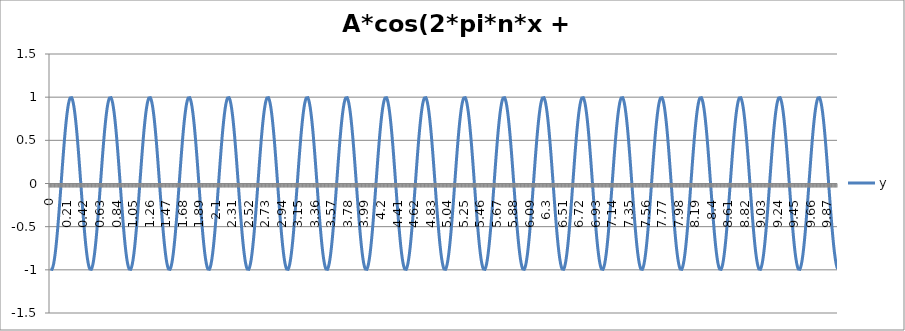
| Category | y |
|---|---|
| 0.0 | -0.99 |
| 0.01 | -1 |
| 0.02 | -0.994 |
| 0.03 | -0.972 |
| 0.04 | -0.936 |
| 0.05 | -0.884 |
| 0.060000000000000005 | -0.818 |
| 0.07 | -0.74 |
| 0.08 | -0.65 |
| 0.09 | -0.549 |
| 0.09999999999999999 | -0.44 |
| 0.10999999999999999 | -0.324 |
| 0.11999999999999998 | -0.203 |
| 0.12999999999999998 | -0.079 |
| 0.13999999999999999 | 0.047 |
| 0.15 | 0.172 |
| 0.16 | 0.294 |
| 0.17 | 0.411 |
| 0.18000000000000002 | 0.522 |
| 0.19000000000000003 | 0.625 |
| 0.20000000000000004 | 0.718 |
| 0.21000000000000005 | 0.8 |
| 0.22000000000000006 | 0.869 |
| 0.23000000000000007 | 0.924 |
| 0.24000000000000007 | 0.964 |
| 0.25000000000000006 | 0.99 |
| 0.26000000000000006 | 1 |
| 0.2700000000000001 | 0.994 |
| 0.2800000000000001 | 0.972 |
| 0.2900000000000001 | 0.936 |
| 0.3000000000000001 | 0.884 |
| 0.3100000000000001 | 0.818 |
| 0.3200000000000001 | 0.74 |
| 0.3300000000000001 | 0.65 |
| 0.34000000000000014 | 0.549 |
| 0.35000000000000014 | 0.44 |
| 0.36000000000000015 | 0.324 |
| 0.37000000000000016 | 0.203 |
| 0.38000000000000017 | 0.079 |
| 0.3900000000000002 | -0.047 |
| 0.4000000000000002 | -0.172 |
| 0.4100000000000002 | -0.294 |
| 0.4200000000000002 | -0.411 |
| 0.4300000000000002 | -0.522 |
| 0.4400000000000002 | -0.625 |
| 0.45000000000000023 | -0.718 |
| 0.46000000000000024 | -0.8 |
| 0.47000000000000025 | -0.869 |
| 0.48000000000000026 | -0.924 |
| 0.49000000000000027 | -0.964 |
| 0.5000000000000002 | -0.99 |
| 0.5100000000000002 | -1 |
| 0.5200000000000002 | -0.994 |
| 0.5300000000000002 | -0.972 |
| 0.5400000000000003 | -0.936 |
| 0.5500000000000003 | -0.884 |
| 0.5600000000000003 | -0.818 |
| 0.5700000000000003 | -0.74 |
| 0.5800000000000003 | -0.65 |
| 0.5900000000000003 | -0.549 |
| 0.6000000000000003 | -0.44 |
| 0.6100000000000003 | -0.324 |
| 0.6200000000000003 | -0.203 |
| 0.6300000000000003 | -0.079 |
| 0.6400000000000003 | 0.047 |
| 0.6500000000000004 | 0.172 |
| 0.6600000000000004 | 0.294 |
| 0.6700000000000004 | 0.411 |
| 0.6800000000000004 | 0.522 |
| 0.6900000000000004 | 0.625 |
| 0.7000000000000004 | 0.718 |
| 0.7100000000000004 | 0.8 |
| 0.7200000000000004 | 0.869 |
| 0.7300000000000004 | 0.924 |
| 0.7400000000000004 | 0.964 |
| 0.7500000000000004 | 0.99 |
| 0.7600000000000005 | 1 |
| 0.7700000000000005 | 0.994 |
| 0.7800000000000005 | 0.972 |
| 0.7900000000000005 | 0.936 |
| 0.8000000000000005 | 0.884 |
| 0.8100000000000005 | 0.818 |
| 0.8200000000000005 | 0.74 |
| 0.8300000000000005 | 0.65 |
| 0.8400000000000005 | 0.549 |
| 0.8500000000000005 | 0.44 |
| 0.8600000000000005 | 0.324 |
| 0.8700000000000006 | 0.203 |
| 0.8800000000000006 | 0.079 |
| 0.8900000000000006 | -0.047 |
| 0.9000000000000006 | -0.172 |
| 0.9100000000000006 | -0.294 |
| 0.9200000000000006 | -0.411 |
| 0.9300000000000006 | -0.522 |
| 0.9400000000000006 | -0.625 |
| 0.9500000000000006 | -0.718 |
| 0.9600000000000006 | -0.8 |
| 0.9700000000000006 | -0.869 |
| 0.9800000000000006 | -0.924 |
| 0.9900000000000007 | -0.964 |
| 1.0000000000000007 | -0.99 |
| 1.0100000000000007 | -1 |
| 1.0200000000000007 | -0.994 |
| 1.0300000000000007 | -0.972 |
| 1.0400000000000007 | -0.936 |
| 1.0500000000000007 | -0.884 |
| 1.0600000000000007 | -0.818 |
| 1.0700000000000007 | -0.74 |
| 1.0800000000000007 | -0.65 |
| 1.0900000000000007 | -0.549 |
| 1.1000000000000008 | -0.44 |
| 1.1100000000000008 | -0.324 |
| 1.1200000000000008 | -0.203 |
| 1.1300000000000008 | -0.079 |
| 1.1400000000000008 | 0.047 |
| 1.1500000000000008 | 0.172 |
| 1.1600000000000008 | 0.294 |
| 1.1700000000000008 | 0.411 |
| 1.1800000000000008 | 0.522 |
| 1.1900000000000008 | 0.625 |
| 1.2000000000000008 | 0.718 |
| 1.2100000000000009 | 0.8 |
| 1.2200000000000009 | 0.869 |
| 1.2300000000000009 | 0.924 |
| 1.2400000000000009 | 0.964 |
| 1.2500000000000009 | 0.99 |
| 1.260000000000001 | 1 |
| 1.270000000000001 | 0.994 |
| 1.280000000000001 | 0.972 |
| 1.290000000000001 | 0.936 |
| 1.300000000000001 | 0.884 |
| 1.310000000000001 | 0.818 |
| 1.320000000000001 | 0.74 |
| 1.330000000000001 | 0.65 |
| 1.340000000000001 | 0.549 |
| 1.350000000000001 | 0.44 |
| 1.360000000000001 | 0.324 |
| 1.370000000000001 | 0.203 |
| 1.380000000000001 | 0.079 |
| 1.390000000000001 | -0.047 |
| 1.400000000000001 | -0.172 |
| 1.410000000000001 | -0.294 |
| 1.420000000000001 | -0.411 |
| 1.430000000000001 | -0.522 |
| 1.440000000000001 | -0.625 |
| 1.450000000000001 | -0.718 |
| 1.460000000000001 | -0.8 |
| 1.470000000000001 | -0.869 |
| 1.480000000000001 | -0.924 |
| 1.490000000000001 | -0.964 |
| 1.500000000000001 | -0.99 |
| 1.5100000000000011 | -1 |
| 1.5200000000000011 | -0.994 |
| 1.5300000000000011 | -0.972 |
| 1.5400000000000011 | -0.936 |
| 1.5500000000000012 | -0.884 |
| 1.5600000000000012 | -0.818 |
| 1.5700000000000012 | -0.74 |
| 1.5800000000000012 | -0.65 |
| 1.5900000000000012 | -0.549 |
| 1.6000000000000012 | -0.44 |
| 1.6100000000000012 | -0.324 |
| 1.6200000000000012 | -0.203 |
| 1.6300000000000012 | -0.079 |
| 1.6400000000000012 | 0.047 |
| 1.6500000000000012 | 0.172 |
| 1.6600000000000013 | 0.294 |
| 1.6700000000000013 | 0.411 |
| 1.6800000000000013 | 0.522 |
| 1.6900000000000013 | 0.625 |
| 1.7000000000000013 | 0.718 |
| 1.7100000000000013 | 0.8 |
| 1.7200000000000013 | 0.869 |
| 1.7300000000000013 | 0.924 |
| 1.7400000000000013 | 0.964 |
| 1.7500000000000013 | 0.99 |
| 1.7600000000000013 | 1 |
| 1.7700000000000014 | 0.994 |
| 1.7800000000000014 | 0.972 |
| 1.7900000000000014 | 0.936 |
| 1.8000000000000014 | 0.884 |
| 1.8100000000000014 | 0.818 |
| 1.8200000000000014 | 0.74 |
| 1.8300000000000014 | 0.65 |
| 1.8400000000000014 | 0.549 |
| 1.8500000000000014 | 0.44 |
| 1.8600000000000014 | 0.324 |
| 1.8700000000000014 | 0.203 |
| 1.8800000000000014 | 0.079 |
| 1.8900000000000015 | -0.047 |
| 1.9000000000000015 | -0.172 |
| 1.9100000000000015 | -0.294 |
| 1.9200000000000015 | -0.411 |
| 1.9300000000000015 | -0.522 |
| 1.9400000000000015 | -0.625 |
| 1.9500000000000015 | -0.718 |
| 1.9600000000000015 | -0.8 |
| 1.9700000000000015 | -0.869 |
| 1.9800000000000015 | -0.924 |
| 1.9900000000000015 | -0.964 |
| 2.0000000000000013 | -0.99 |
| 2.010000000000001 | -1 |
| 2.020000000000001 | -0.994 |
| 2.0300000000000007 | -0.972 |
| 2.0400000000000005 | -0.936 |
| 2.0500000000000003 | -0.884 |
| 2.06 | -0.818 |
| 2.07 | -0.74 |
| 2.0799999999999996 | -0.65 |
| 2.0899999999999994 | -0.549 |
| 2.099999999999999 | -0.44 |
| 2.109999999999999 | -0.324 |
| 2.1199999999999988 | -0.203 |
| 2.1299999999999986 | -0.079 |
| 2.1399999999999983 | 0.047 |
| 2.149999999999998 | 0.172 |
| 2.159999999999998 | 0.294 |
| 2.1699999999999977 | 0.411 |
| 2.1799999999999975 | 0.522 |
| 2.1899999999999973 | 0.625 |
| 2.199999999999997 | 0.718 |
| 2.209999999999997 | 0.8 |
| 2.2199999999999966 | 0.869 |
| 2.2299999999999964 | 0.924 |
| 2.239999999999996 | 0.964 |
| 2.249999999999996 | 0.99 |
| 2.259999999999996 | 1 |
| 2.2699999999999956 | 0.994 |
| 2.2799999999999954 | 0.972 |
| 2.289999999999995 | 0.936 |
| 2.299999999999995 | 0.884 |
| 2.3099999999999947 | 0.818 |
| 2.3199999999999945 | 0.74 |
| 2.3299999999999943 | 0.65 |
| 2.339999999999994 | 0.549 |
| 2.349999999999994 | 0.44 |
| 2.3599999999999937 | 0.324 |
| 2.3699999999999934 | 0.203 |
| 2.3799999999999932 | 0.079 |
| 2.389999999999993 | -0.047 |
| 2.399999999999993 | -0.172 |
| 2.4099999999999926 | -0.294 |
| 2.4199999999999924 | -0.411 |
| 2.429999999999992 | -0.522 |
| 2.439999999999992 | -0.625 |
| 2.4499999999999917 | -0.718 |
| 2.4599999999999915 | -0.8 |
| 2.4699999999999913 | -0.869 |
| 2.479999999999991 | -0.924 |
| 2.489999999999991 | -0.964 |
| 2.4999999999999907 | -0.99 |
| 2.5099999999999905 | -1 |
| 2.5199999999999902 | -0.994 |
| 2.52999999999999 | -0.972 |
| 2.53999999999999 | -0.936 |
| 2.5499999999999896 | -0.884 |
| 2.5599999999999894 | -0.818 |
| 2.569999999999989 | -0.74 |
| 2.579999999999989 | -0.65 |
| 2.5899999999999888 | -0.549 |
| 2.5999999999999885 | -0.44 |
| 2.6099999999999883 | -0.324 |
| 2.619999999999988 | -0.203 |
| 2.629999999999988 | -0.079 |
| 2.6399999999999877 | 0.047 |
| 2.6499999999999875 | 0.172 |
| 2.6599999999999873 | 0.294 |
| 2.669999999999987 | 0.411 |
| 2.679999999999987 | 0.522 |
| 2.6899999999999866 | 0.625 |
| 2.6999999999999864 | 0.718 |
| 2.709999999999986 | 0.8 |
| 2.719999999999986 | 0.869 |
| 2.7299999999999858 | 0.924 |
| 2.7399999999999856 | 0.964 |
| 2.7499999999999853 | 0.99 |
| 2.759999999999985 | 1 |
| 2.769999999999985 | 0.994 |
| 2.7799999999999847 | 0.972 |
| 2.7899999999999845 | 0.936 |
| 2.7999999999999843 | 0.884 |
| 2.809999999999984 | 0.818 |
| 2.819999999999984 | 0.74 |
| 2.8299999999999836 | 0.65 |
| 2.8399999999999834 | 0.549 |
| 2.849999999999983 | 0.44 |
| 2.859999999999983 | 0.324 |
| 2.869999999999983 | 0.203 |
| 2.8799999999999826 | 0.079 |
| 2.8899999999999824 | -0.047 |
| 2.899999999999982 | -0.172 |
| 2.909999999999982 | -0.294 |
| 2.9199999999999817 | -0.411 |
| 2.9299999999999815 | -0.522 |
| 2.9399999999999813 | -0.625 |
| 2.949999999999981 | -0.718 |
| 2.959999999999981 | -0.8 |
| 2.9699999999999807 | -0.869 |
| 2.9799999999999804 | -0.924 |
| 2.9899999999999802 | -0.964 |
| 2.99999999999998 | -0.99 |
| 3.00999999999998 | -1 |
| 3.0199999999999796 | -0.994 |
| 3.0299999999999794 | -0.972 |
| 3.039999999999979 | -0.936 |
| 3.049999999999979 | -0.884 |
| 3.0599999999999787 | -0.818 |
| 3.0699999999999785 | -0.74 |
| 3.0799999999999783 | -0.65 |
| 3.089999999999978 | -0.549 |
| 3.099999999999978 | -0.44 |
| 3.1099999999999777 | -0.324 |
| 3.1199999999999775 | -0.203 |
| 3.1299999999999772 | -0.079 |
| 3.139999999999977 | 0.047 |
| 3.149999999999977 | 0.172 |
| 3.1599999999999766 | 0.294 |
| 3.1699999999999764 | 0.411 |
| 3.179999999999976 | 0.522 |
| 3.189999999999976 | 0.625 |
| 3.1999999999999758 | 0.718 |
| 3.2099999999999755 | 0.8 |
| 3.2199999999999753 | 0.869 |
| 3.229999999999975 | 0.924 |
| 3.239999999999975 | 0.964 |
| 3.2499999999999747 | 0.99 |
| 3.2599999999999745 | 1 |
| 3.2699999999999743 | 0.994 |
| 3.279999999999974 | 0.972 |
| 3.289999999999974 | 0.936 |
| 3.2999999999999736 | 0.884 |
| 3.3099999999999734 | 0.818 |
| 3.319999999999973 | 0.74 |
| 3.329999999999973 | 0.65 |
| 3.3399999999999728 | 0.549 |
| 3.3499999999999726 | 0.44 |
| 3.3599999999999723 | 0.324 |
| 3.369999999999972 | 0.203 |
| 3.379999999999972 | 0.079 |
| 3.3899999999999717 | -0.047 |
| 3.3999999999999715 | -0.172 |
| 3.4099999999999713 | -0.294 |
| 3.419999999999971 | -0.411 |
| 3.429999999999971 | -0.522 |
| 3.4399999999999706 | -0.625 |
| 3.4499999999999704 | -0.718 |
| 3.45999999999997 | -0.8 |
| 3.46999999999997 | -0.869 |
| 3.47999999999997 | -0.924 |
| 3.4899999999999696 | -0.964 |
| 3.4999999999999694 | -0.99 |
| 3.509999999999969 | -1 |
| 3.519999999999969 | -0.994 |
| 3.5299999999999687 | -0.972 |
| 3.5399999999999685 | -0.936 |
| 3.5499999999999683 | -0.884 |
| 3.559999999999968 | -0.818 |
| 3.569999999999968 | -0.74 |
| 3.5799999999999677 | -0.65 |
| 3.5899999999999674 | -0.549 |
| 3.5999999999999672 | -0.44 |
| 3.609999999999967 | -0.324 |
| 3.619999999999967 | -0.203 |
| 3.6299999999999666 | -0.079 |
| 3.6399999999999664 | 0.047 |
| 3.649999999999966 | 0.172 |
| 3.659999999999966 | 0.294 |
| 3.6699999999999657 | 0.411 |
| 3.6799999999999655 | 0.522 |
| 3.6899999999999653 | 0.625 |
| 3.699999999999965 | 0.718 |
| 3.709999999999965 | 0.8 |
| 3.7199999999999647 | 0.869 |
| 3.7299999999999645 | 0.924 |
| 3.7399999999999642 | 0.964 |
| 3.749999999999964 | 0.99 |
| 3.759999999999964 | 1 |
| 3.7699999999999636 | 0.994 |
| 3.7799999999999634 | 0.972 |
| 3.789999999999963 | 0.936 |
| 3.799999999999963 | 0.884 |
| 3.8099999999999627 | 0.818 |
| 3.8199999999999625 | 0.74 |
| 3.8299999999999623 | 0.65 |
| 3.839999999999962 | 0.549 |
| 3.849999999999962 | 0.44 |
| 3.8599999999999617 | 0.324 |
| 3.8699999999999615 | 0.203 |
| 3.8799999999999613 | 0.079 |
| 3.889999999999961 | -0.047 |
| 3.899999999999961 | -0.172 |
| 3.9099999999999606 | -0.294 |
| 3.9199999999999604 | -0.411 |
| 3.92999999999996 | -0.522 |
| 3.93999999999996 | -0.625 |
| 3.9499999999999598 | -0.718 |
| 3.9599999999999596 | -0.8 |
| 3.9699999999999593 | -0.869 |
| 3.979999999999959 | -0.924 |
| 3.989999999999959 | -0.964 |
| 3.9999999999999587 | -0.99 |
| 4.009999999999959 | -1 |
| 4.019999999999959 | -0.994 |
| 4.0299999999999585 | -0.972 |
| 4.039999999999958 | -0.936 |
| 4.049999999999958 | -0.884 |
| 4.059999999999958 | -0.818 |
| 4.069999999999958 | -0.74 |
| 4.079999999999957 | -0.65 |
| 4.089999999999957 | -0.549 |
| 4.099999999999957 | -0.44 |
| 4.109999999999957 | -0.324 |
| 4.119999999999957 | -0.203 |
| 4.129999999999956 | -0.079 |
| 4.139999999999956 | 0.047 |
| 4.149999999999956 | 0.172 |
| 4.159999999999956 | 0.294 |
| 4.1699999999999555 | 0.411 |
| 4.179999999999955 | 0.522 |
| 4.189999999999955 | 0.625 |
| 4.199999999999955 | 0.718 |
| 4.209999999999955 | 0.8 |
| 4.2199999999999545 | 0.869 |
| 4.229999999999954 | 0.924 |
| 4.239999999999954 | 0.964 |
| 4.249999999999954 | 0.99 |
| 4.259999999999954 | 1 |
| 4.269999999999953 | 0.994 |
| 4.279999999999953 | 0.972 |
| 4.289999999999953 | 0.936 |
| 4.299999999999953 | 0.884 |
| 4.3099999999999525 | 0.818 |
| 4.319999999999952 | 0.74 |
| 4.329999999999952 | 0.65 |
| 4.339999999999952 | 0.549 |
| 4.349999999999952 | 0.44 |
| 4.3599999999999515 | 0.324 |
| 4.369999999999951 | 0.203 |
| 4.379999999999951 | 0.079 |
| 4.389999999999951 | -0.047 |
| 4.399999999999951 | -0.172 |
| 4.40999999999995 | -0.294 |
| 4.41999999999995 | -0.411 |
| 4.42999999999995 | -0.522 |
| 4.43999999999995 | -0.625 |
| 4.4499999999999496 | -0.718 |
| 4.459999999999949 | -0.8 |
| 4.469999999999949 | -0.869 |
| 4.479999999999949 | -0.924 |
| 4.489999999999949 | -0.964 |
| 4.4999999999999485 | -0.99 |
| 4.509999999999948 | -1 |
| 4.519999999999948 | -0.994 |
| 4.529999999999948 | -0.972 |
| 4.539999999999948 | -0.936 |
| 4.549999999999947 | -0.884 |
| 4.559999999999947 | -0.818 |
| 4.569999999999947 | -0.74 |
| 4.579999999999947 | -0.65 |
| 4.589999999999947 | -0.549 |
| 4.599999999999946 | -0.44 |
| 4.609999999999946 | -0.324 |
| 4.619999999999946 | -0.203 |
| 4.629999999999946 | -0.079 |
| 4.6399999999999455 | 0.047 |
| 4.649999999999945 | 0.172 |
| 4.659999999999945 | 0.294 |
| 4.669999999999945 | 0.411 |
| 4.679999999999945 | 0.522 |
| 4.689999999999944 | 0.625 |
| 4.699999999999944 | 0.718 |
| 4.709999999999944 | 0.8 |
| 4.719999999999944 | 0.869 |
| 4.729999999999944 | 0.924 |
| 4.739999999999943 | 0.964 |
| 4.749999999999943 | 0.99 |
| 4.759999999999943 | 1 |
| 4.769999999999943 | 0.994 |
| 4.7799999999999425 | 0.972 |
| 4.789999999999942 | 0.936 |
| 4.799999999999942 | 0.884 |
| 4.809999999999942 | 0.818 |
| 4.819999999999942 | 0.74 |
| 4.8299999999999415 | 0.65 |
| 4.839999999999941 | 0.549 |
| 4.849999999999941 | 0.44 |
| 4.859999999999941 | 0.324 |
| 4.869999999999941 | 0.203 |
| 4.87999999999994 | 0.079 |
| 4.88999999999994 | -0.047 |
| 4.89999999999994 | -0.172 |
| 4.90999999999994 | -0.294 |
| 4.9199999999999395 | -0.411 |
| 4.929999999999939 | -0.522 |
| 4.939999999999939 | -0.625 |
| 4.949999999999939 | -0.718 |
| 4.959999999999939 | -0.8 |
| 4.9699999999999385 | -0.869 |
| 4.979999999999938 | -0.924 |
| 4.989999999999938 | -0.964 |
| 4.999999999999938 | -0.99 |
| 5.009999999999938 | -1 |
| 5.019999999999937 | -0.994 |
| 5.029999999999937 | -0.972 |
| 5.039999999999937 | -0.936 |
| 5.049999999999937 | -0.884 |
| 5.0599999999999365 | -0.818 |
| 5.069999999999936 | -0.74 |
| 5.079999999999936 | -0.65 |
| 5.089999999999936 | -0.549 |
| 5.099999999999936 | -0.44 |
| 5.1099999999999355 | -0.324 |
| 5.119999999999935 | -0.203 |
| 5.129999999999935 | -0.079 |
| 5.139999999999935 | 0.047 |
| 5.149999999999935 | 0.172 |
| 5.159999999999934 | 0.294 |
| 5.169999999999934 | 0.411 |
| 5.179999999999934 | 0.522 |
| 5.189999999999934 | 0.625 |
| 5.199999999999934 | 0.718 |
| 5.209999999999933 | 0.8 |
| 5.219999999999933 | 0.869 |
| 5.229999999999933 | 0.924 |
| 5.239999999999933 | 0.964 |
| 5.2499999999999325 | 0.99 |
| 5.259999999999932 | 1 |
| 5.269999999999932 | 0.994 |
| 5.279999999999932 | 0.972 |
| 5.289999999999932 | 0.936 |
| 5.299999999999931 | 0.884 |
| 5.309999999999931 | 0.818 |
| 5.319999999999931 | 0.74 |
| 5.329999999999931 | 0.65 |
| 5.339999999999931 | 0.549 |
| 5.34999999999993 | 0.44 |
| 5.35999999999993 | 0.324 |
| 5.36999999999993 | 0.203 |
| 5.37999999999993 | 0.079 |
| 5.3899999999999295 | -0.047 |
| 5.399999999999929 | -0.172 |
| 5.409999999999929 | -0.294 |
| 5.419999999999929 | -0.411 |
| 5.429999999999929 | -0.522 |
| 5.4399999999999284 | -0.625 |
| 5.449999999999928 | -0.718 |
| 5.459999999999928 | -0.8 |
| 5.469999999999928 | -0.869 |
| 5.479999999999928 | -0.924 |
| 5.489999999999927 | -0.964 |
| 5.499999999999927 | -0.99 |
| 5.509999999999927 | -1 |
| 5.519999999999927 | -0.994 |
| 5.5299999999999265 | -0.972 |
| 5.539999999999926 | -0.936 |
| 5.549999999999926 | -0.884 |
| 5.559999999999926 | -0.818 |
| 5.569999999999926 | -0.74 |
| 5.5799999999999255 | -0.65 |
| 5.589999999999925 | -0.549 |
| 5.599999999999925 | -0.44 |
| 5.609999999999925 | -0.324 |
| 5.619999999999925 | -0.203 |
| 5.629999999999924 | -0.079 |
| 5.639999999999924 | 0.047 |
| 5.649999999999924 | 0.172 |
| 5.659999999999924 | 0.294 |
| 5.6699999999999235 | 0.411 |
| 5.679999999999923 | 0.522 |
| 5.689999999999923 | 0.625 |
| 5.699999999999923 | 0.718 |
| 5.709999999999923 | 0.8 |
| 5.7199999999999225 | 0.869 |
| 5.729999999999922 | 0.924 |
| 5.739999999999922 | 0.964 |
| 5.749999999999922 | 0.99 |
| 5.759999999999922 | 1 |
| 5.769999999999921 | 0.994 |
| 5.779999999999921 | 0.972 |
| 5.789999999999921 | 0.936 |
| 5.799999999999921 | 0.884 |
| 5.809999999999921 | 0.818 |
| 5.81999999999992 | 0.74 |
| 5.82999999999992 | 0.65 |
| 5.83999999999992 | 0.549 |
| 5.84999999999992 | 0.44 |
| 5.8599999999999195 | 0.324 |
| 5.869999999999919 | 0.203 |
| 5.879999999999919 | 0.079 |
| 5.889999999999919 | -0.047 |
| 5.899999999999919 | -0.172 |
| 5.909999999999918 | -0.294 |
| 5.919999999999918 | -0.411 |
| 5.929999999999918 | -0.522 |
| 5.939999999999918 | -0.625 |
| 5.949999999999918 | -0.718 |
| 5.959999999999917 | -0.8 |
| 5.969999999999917 | -0.869 |
| 5.979999999999917 | -0.924 |
| 5.989999999999917 | -0.964 |
| 5.9999999999999165 | -0.99 |
| 6.009999999999916 | -1 |
| 6.019999999999916 | -0.994 |
| 6.029999999999916 | -0.972 |
| 6.039999999999916 | -0.936 |
| 6.0499999999999154 | -0.884 |
| 6.059999999999915 | -0.818 |
| 6.069999999999915 | -0.74 |
| 6.079999999999915 | -0.65 |
| 6.089999999999915 | -0.549 |
| 6.099999999999914 | -0.44 |
| 6.109999999999914 | -0.324 |
| 6.119999999999914 | -0.203 |
| 6.129999999999914 | -0.079 |
| 6.1399999999999135 | 0.047 |
| 6.149999999999913 | 0.172 |
| 6.159999999999913 | 0.294 |
| 6.169999999999913 | 0.411 |
| 6.179999999999913 | 0.522 |
| 6.1899999999999125 | 0.625 |
| 6.199999999999912 | 0.718 |
| 6.209999999999912 | 0.8 |
| 6.219999999999912 | 0.869 |
| 6.229999999999912 | 0.924 |
| 6.239999999999911 | 0.964 |
| 6.249999999999911 | 0.99 |
| 6.259999999999911 | 1 |
| 6.269999999999911 | 0.994 |
| 6.2799999999999105 | 0.972 |
| 6.28999999999991 | 0.936 |
| 6.29999999999991 | 0.884 |
| 6.30999999999991 | 0.818 |
| 6.31999999999991 | 0.74 |
| 6.3299999999999095 | 0.65 |
| 6.339999999999909 | 0.549 |
| 6.349999999999909 | 0.44 |
| 6.359999999999909 | 0.324 |
| 6.369999999999909 | 0.203 |
| 6.379999999999908 | 0.079 |
| 6.389999999999908 | -0.047 |
| 6.399999999999908 | -0.172 |
| 6.409999999999908 | -0.294 |
| 6.419999999999908 | -0.411 |
| 6.429999999999907 | -0.522 |
| 6.439999999999907 | -0.625 |
| 6.449999999999907 | -0.718 |
| 6.459999999999907 | -0.8 |
| 6.4699999999999065 | -0.869 |
| 6.479999999999906 | -0.924 |
| 6.489999999999906 | -0.964 |
| 6.499999999999906 | -0.99 |
| 6.509999999999906 | -1 |
| 6.519999999999905 | -0.994 |
| 6.529999999999905 | -0.972 |
| 6.539999999999905 | -0.936 |
| 6.549999999999905 | -0.884 |
| 6.559999999999905 | -0.818 |
| 6.569999999999904 | -0.74 |
| 6.579999999999904 | -0.65 |
| 6.589999999999904 | -0.549 |
| 6.599999999999904 | -0.44 |
| 6.6099999999999035 | -0.324 |
| 6.619999999999903 | -0.203 |
| 6.629999999999903 | -0.079 |
| 6.639999999999903 | 0.047 |
| 6.649999999999903 | 0.172 |
| 6.659999999999902 | 0.294 |
| 6.669999999999902 | 0.411 |
| 6.679999999999902 | 0.522 |
| 6.689999999999902 | 0.625 |
| 6.699999999999902 | 0.718 |
| 6.709999999999901 | 0.8 |
| 6.719999999999901 | 0.869 |
| 6.729999999999901 | 0.924 |
| 6.739999999999901 | 0.964 |
| 6.7499999999999005 | 0.99 |
| 6.7599999999999 | 1 |
| 6.7699999999999 | 0.994 |
| 6.7799999999999 | 0.972 |
| 6.7899999999999 | 0.936 |
| 6.7999999999998995 | 0.884 |
| 6.809999999999899 | 0.818 |
| 6.819999999999899 | 0.74 |
| 6.829999999999899 | 0.65 |
| 6.839999999999899 | 0.549 |
| 6.849999999999898 | 0.44 |
| 6.859999999999898 | 0.324 |
| 6.869999999999898 | 0.203 |
| 6.879999999999898 | 0.079 |
| 6.8899999999998975 | -0.047 |
| 6.899999999999897 | -0.172 |
| 6.909999999999897 | -0.294 |
| 6.919999999999897 | -0.411 |
| 6.929999999999897 | -0.522 |
| 6.9399999999998965 | -0.625 |
| 6.949999999999896 | -0.718 |
| 6.959999999999896 | -0.8 |
| 6.969999999999896 | -0.869 |
| 6.979999999999896 | -0.924 |
| 6.989999999999895 | -0.964 |
| 6.999999999999895 | -0.99 |
| 7.009999999999895 | -1 |
| 7.019999999999895 | -0.994 |
| 7.0299999999998946 | -0.972 |
| 7.039999999999894 | -0.936 |
| 7.049999999999894 | -0.884 |
| 7.059999999999894 | -0.818 |
| 7.069999999999894 | -0.74 |
| 7.0799999999998935 | -0.65 |
| 7.089999999999893 | -0.549 |
| 7.099999999999893 | -0.44 |
| 7.109999999999893 | -0.324 |
| 7.119999999999893 | -0.203 |
| 7.129999999999892 | -0.079 |
| 7.139999999999892 | 0.047 |
| 7.149999999999892 | 0.172 |
| 7.159999999999892 | 0.294 |
| 7.169999999999892 | 0.411 |
| 7.179999999999891 | 0.522 |
| 7.189999999999891 | 0.625 |
| 7.199999999999891 | 0.718 |
| 7.209999999999891 | 0.8 |
| 7.2199999999998905 | 0.869 |
| 7.22999999999989 | 0.924 |
| 7.23999999999989 | 0.964 |
| 7.24999999999989 | 0.99 |
| 7.25999999999989 | 1 |
| 7.269999999999889 | 0.994 |
| 7.279999999999889 | 0.972 |
| 7.289999999999889 | 0.936 |
| 7.299999999999889 | 0.884 |
| 7.309999999999889 | 0.818 |
| 7.319999999999888 | 0.74 |
| 7.329999999999888 | 0.65 |
| 7.339999999999888 | 0.549 |
| 7.349999999999888 | 0.44 |
| 7.3599999999998875 | 0.324 |
| 7.369999999999887 | 0.203 |
| 7.379999999999887 | 0.079 |
| 7.389999999999887 | -0.047 |
| 7.399999999999887 | -0.172 |
| 7.4099999999998865 | -0.294 |
| 7.419999999999886 | -0.411 |
| 7.429999999999886 | -0.522 |
| 7.439999999999886 | -0.625 |
| 7.449999999999886 | -0.718 |
| 7.459999999999885 | -0.8 |
| 7.469999999999885 | -0.869 |
| 7.479999999999885 | -0.924 |
| 7.489999999999885 | -0.964 |
| 7.4999999999998845 | -0.99 |
| 7.509999999999884 | -1 |
| 7.519999999999884 | -0.994 |
| 7.529999999999884 | -0.972 |
| 7.539999999999884 | -0.936 |
| 7.5499999999998835 | -0.884 |
| 7.559999999999883 | -0.818 |
| 7.569999999999883 | -0.74 |
| 7.579999999999883 | -0.65 |
| 7.589999999999883 | -0.549 |
| 7.599999999999882 | -0.44 |
| 7.609999999999882 | -0.324 |
| 7.619999999999882 | -0.203 |
| 7.629999999999882 | -0.079 |
| 7.6399999999998816 | 0.047 |
| 7.649999999999881 | 0.172 |
| 7.659999999999881 | 0.294 |
| 7.669999999999881 | 0.411 |
| 7.679999999999881 | 0.522 |
| 7.6899999999998805 | 0.625 |
| 7.69999999999988 | 0.718 |
| 7.70999999999988 | 0.8 |
| 7.71999999999988 | 0.869 |
| 7.72999999999988 | 0.924 |
| 7.739999999999879 | 0.964 |
| 7.749999999999879 | 0.99 |
| 7.759999999999879 | 1 |
| 7.769999999999879 | 0.994 |
| 7.779999999999879 | 0.972 |
| 7.789999999999878 | 0.936 |
| 7.799999999999878 | 0.884 |
| 7.809999999999878 | 0.818 |
| 7.819999999999878 | 0.74 |
| 7.8299999999998775 | 0.65 |
| 7.839999999999877 | 0.549 |
| 7.849999999999877 | 0.44 |
| 7.859999999999877 | 0.324 |
| 7.869999999999877 | 0.203 |
| 7.879999999999876 | 0.079 |
| 7.889999999999876 | -0.047 |
| 7.899999999999876 | -0.172 |
| 7.909999999999876 | -0.294 |
| 7.919999999999876 | -0.411 |
| 7.929999999999875 | -0.522 |
| 7.939999999999875 | -0.625 |
| 7.949999999999875 | -0.718 |
| 7.959999999999875 | -0.8 |
| 7.9699999999998745 | -0.869 |
| 7.979999999999874 | -0.924 |
| 7.989999999999874 | -0.964 |
| 7.999999999999874 | -0.99 |
| 8.009999999999874 | -1 |
| 8.019999999999873 | -0.994 |
| 8.029999999999873 | -0.972 |
| 8.039999999999873 | -0.936 |
| 8.049999999999873 | -0.884 |
| 8.059999999999873 | -0.818 |
| 8.069999999999872 | -0.74 |
| 8.079999999999872 | -0.65 |
| 8.089999999999872 | -0.549 |
| 8.099999999999872 | -0.44 |
| 8.109999999999872 | -0.324 |
| 8.119999999999871 | -0.203 |
| 8.129999999999871 | -0.079 |
| 8.139999999999871 | 0.047 |
| 8.14999999999987 | 0.172 |
| 8.15999999999987 | 0.294 |
| 8.16999999999987 | 0.411 |
| 8.17999999999987 | 0.522 |
| 8.18999999999987 | 0.625 |
| 8.19999999999987 | 0.718 |
| 8.20999999999987 | 0.8 |
| 8.21999999999987 | 0.869 |
| 8.229999999999869 | 0.924 |
| 8.239999999999869 | 0.964 |
| 8.249999999999869 | 0.99 |
| 8.259999999999868 | 1 |
| 8.269999999999868 | 0.994 |
| 8.279999999999868 | 0.972 |
| 8.289999999999868 | 0.936 |
| 8.299999999999867 | 0.884 |
| 8.309999999999867 | 0.818 |
| 8.319999999999867 | 0.74 |
| 8.329999999999867 | 0.65 |
| 8.339999999999867 | 0.549 |
| 8.349999999999866 | 0.44 |
| 8.359999999999866 | 0.324 |
| 8.369999999999866 | 0.203 |
| 8.379999999999866 | 0.079 |
| 8.389999999999866 | -0.047 |
| 8.399999999999865 | -0.172 |
| 8.409999999999865 | -0.294 |
| 8.419999999999865 | -0.411 |
| 8.429999999999865 | -0.522 |
| 8.439999999999864 | -0.625 |
| 8.449999999999864 | -0.718 |
| 8.459999999999864 | -0.8 |
| 8.469999999999864 | -0.869 |
| 8.479999999999864 | -0.924 |
| 8.489999999999863 | -0.964 |
| 8.499999999999863 | -0.99 |
| 8.509999999999863 | -1 |
| 8.519999999999863 | -0.994 |
| 8.529999999999863 | -0.972 |
| 8.539999999999862 | -0.936 |
| 8.549999999999862 | -0.884 |
| 8.559999999999862 | -0.818 |
| 8.569999999999862 | -0.74 |
| 8.579999999999862 | -0.65 |
| 8.589999999999861 | -0.549 |
| 8.599999999999861 | -0.44 |
| 8.60999999999986 | -0.324 |
| 8.61999999999986 | -0.203 |
| 8.62999999999986 | -0.079 |
| 8.63999999999986 | 0.047 |
| 8.64999999999986 | 0.172 |
| 8.65999999999986 | 0.294 |
| 8.66999999999986 | 0.411 |
| 8.67999999999986 | 0.522 |
| 8.68999999999986 | 0.625 |
| 8.699999999999859 | 0.718 |
| 8.709999999999859 | 0.8 |
| 8.719999999999859 | 0.869 |
| 8.729999999999858 | 0.924 |
| 8.739999999999858 | 0.964 |
| 8.749999999999858 | 0.99 |
| 8.759999999999858 | 1 |
| 8.769999999999857 | 0.994 |
| 8.779999999999857 | 0.972 |
| 8.789999999999857 | 0.936 |
| 8.799999999999857 | 0.884 |
| 8.809999999999857 | 0.818 |
| 8.819999999999856 | 0.74 |
| 8.829999999999856 | 0.65 |
| 8.839999999999856 | 0.549 |
| 8.849999999999856 | 0.44 |
| 8.859999999999856 | 0.324 |
| 8.869999999999855 | 0.203 |
| 8.879999999999855 | 0.079 |
| 8.889999999999855 | -0.047 |
| 8.899999999999855 | -0.172 |
| 8.909999999999854 | -0.294 |
| 8.919999999999854 | -0.411 |
| 8.929999999999854 | -0.522 |
| 8.939999999999854 | -0.625 |
| 8.949999999999854 | -0.718 |
| 8.959999999999853 | -0.8 |
| 8.969999999999853 | -0.869 |
| 8.979999999999853 | -0.924 |
| 8.989999999999853 | -0.964 |
| 8.999999999999853 | -0.99 |
| 9.009999999999852 | -1 |
| 9.019999999999852 | -0.994 |
| 9.029999999999852 | -0.972 |
| 9.039999999999852 | -0.936 |
| 9.049999999999851 | -0.884 |
| 9.059999999999851 | -0.818 |
| 9.069999999999851 | -0.74 |
| 9.07999999999985 | -0.65 |
| 9.08999999999985 | -0.549 |
| 9.09999999999985 | -0.44 |
| 9.10999999999985 | -0.324 |
| 9.11999999999985 | -0.203 |
| 9.12999999999985 | -0.079 |
| 9.13999999999985 | 0.047 |
| 9.14999999999985 | 0.172 |
| 9.15999999999985 | 0.294 |
| 9.169999999999849 | 0.411 |
| 9.179999999999849 | 0.522 |
| 9.189999999999849 | 0.625 |
| 9.199999999999848 | 0.718 |
| 9.209999999999848 | 0.8 |
| 9.219999999999848 | 0.869 |
| 9.229999999999848 | 0.924 |
| 9.239999999999847 | 0.964 |
| 9.249999999999847 | 0.99 |
| 9.259999999999847 | 1 |
| 9.269999999999847 | 0.994 |
| 9.279999999999847 | 0.972 |
| 9.289999999999846 | 0.936 |
| 9.299999999999846 | 0.884 |
| 9.309999999999846 | 0.818 |
| 9.319999999999846 | 0.74 |
| 9.329999999999846 | 0.65 |
| 9.339999999999845 | 0.549 |
| 9.349999999999845 | 0.44 |
| 9.359999999999845 | 0.324 |
| 9.369999999999845 | 0.203 |
| 9.379999999999844 | 0.079 |
| 9.389999999999844 | -0.047 |
| 9.399999999999844 | -0.172 |
| 9.409999999999844 | -0.294 |
| 9.419999999999844 | -0.411 |
| 9.429999999999843 | -0.522 |
| 9.439999999999843 | -0.625 |
| 9.449999999999843 | -0.718 |
| 9.459999999999843 | -0.8 |
| 9.469999999999843 | -0.869 |
| 9.479999999999842 | -0.924 |
| 9.489999999999842 | -0.964 |
| 9.499999999999842 | -0.99 |
| 9.509999999999842 | -1 |
| 9.519999999999841 | -0.994 |
| 9.529999999999841 | -0.972 |
| 9.539999999999841 | -0.936 |
| 9.54999999999984 | -0.884 |
| 9.55999999999984 | -0.818 |
| 9.56999999999984 | -0.74 |
| 9.57999999999984 | -0.65 |
| 9.58999999999984 | -0.549 |
| 9.59999999999984 | -0.44 |
| 9.60999999999984 | -0.324 |
| 9.61999999999984 | -0.203 |
| 9.62999999999984 | -0.079 |
| 9.639999999999839 | 0.047 |
| 9.649999999999839 | 0.172 |
| 9.659999999999838 | 0.294 |
| 9.669999999999838 | 0.411 |
| 9.679999999999838 | 0.522 |
| 9.689999999999838 | 0.625 |
| 9.699999999999838 | 0.718 |
| 9.709999999999837 | 0.8 |
| 9.719999999999837 | 0.869 |
| 9.729999999999837 | 0.924 |
| 9.739999999999837 | 0.964 |
| 9.749999999999837 | 0.99 |
| 9.759999999999836 | 1 |
| 9.769999999999836 | 0.994 |
| 9.779999999999836 | 0.972 |
| 9.789999999999836 | 0.936 |
| 9.799999999999836 | 0.884 |
| 9.809999999999835 | 0.818 |
| 9.819999999999835 | 0.74 |
| 9.829999999999835 | 0.65 |
| 9.839999999999835 | 0.549 |
| 9.849999999999834 | 0.44 |
| 9.859999999999834 | 0.324 |
| 9.869999999999834 | 0.203 |
| 9.879999999999834 | 0.079 |
| 9.889999999999834 | -0.047 |
| 9.899999999999833 | -0.172 |
| 9.909999999999833 | -0.294 |
| 9.919999999999833 | -0.411 |
| 9.929999999999833 | -0.522 |
| 9.939999999999833 | -0.625 |
| 9.949999999999832 | -0.718 |
| 9.959999999999832 | -0.8 |
| 9.969999999999832 | -0.869 |
| 9.979999999999832 | -0.924 |
| 9.989999999999831 | -0.964 |
| 9.999999999999831 | -0.99 |